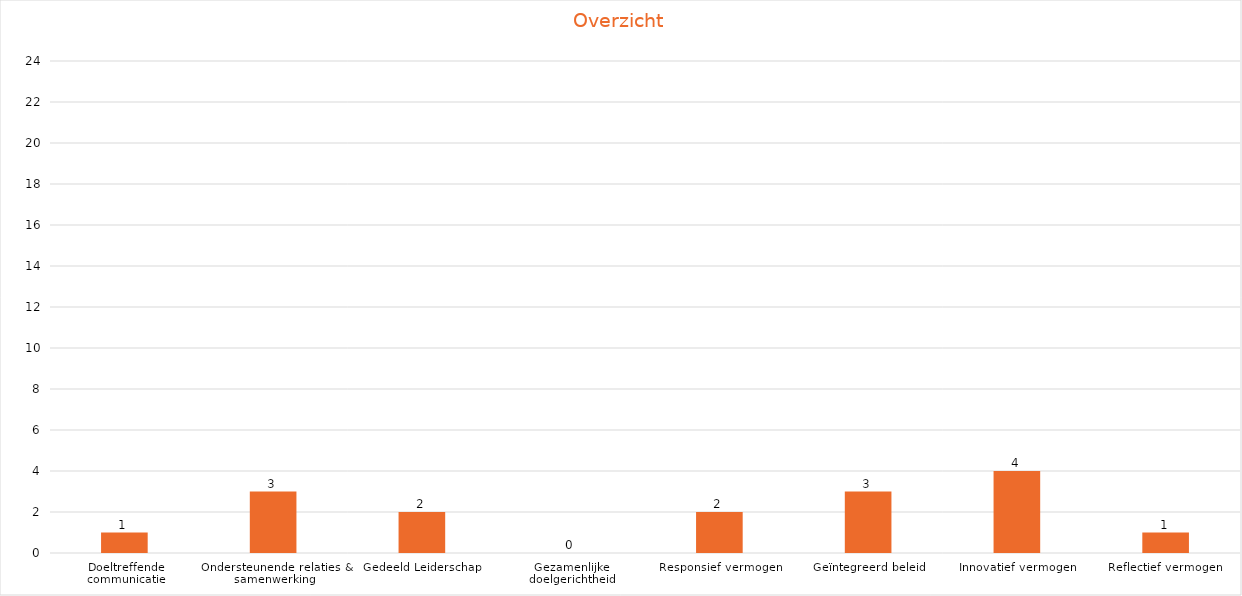
| Category | Series 0 |
|---|---|
| Doeltreffende communicatie | 1 |
| Ondersteunende relaties & samenwerking | 3 |
| Gedeeld Leiderschap | 2 |
| Gezamenlijke doelgerichtheid | 0 |
| Responsief vermogen | 2 |
| Geïntegreerd beleid | 3 |
| Innovatief vermogen | 4 |
| Reflectief vermogen  | 1 |